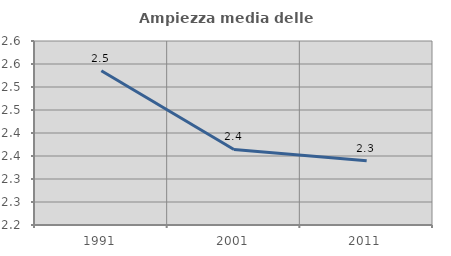
| Category | Ampiezza media delle famiglie |
|---|---|
| 1991.0 | 2.535 |
| 2001.0 | 2.364 |
| 2011.0 | 2.34 |